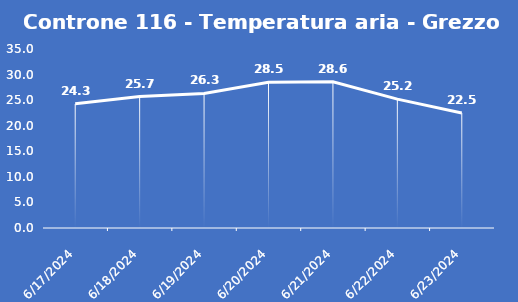
| Category | Controne 116 - Temperatura aria - Grezzo (°C) |
|---|---|
| 6/17/24 | 24.3 |
| 6/18/24 | 25.7 |
| 6/19/24 | 26.3 |
| 6/20/24 | 28.5 |
| 6/21/24 | 28.6 |
| 6/22/24 | 25.2 |
| 6/23/24 | 22.5 |